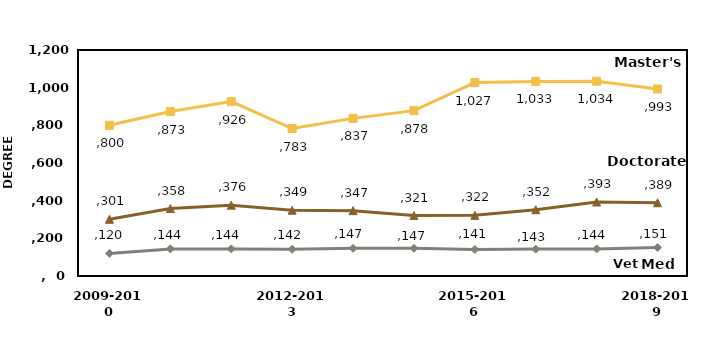
| Category | Series 0 | Series 1 | Series 2 |
|---|---|---|---|
| 2009-2010 | 120 | 800 | 301 |
| 2010-2011 | 144 | 873 | 358 |
| 2011-2012 | 144 | 926 | 376 |
| 2012-2013 | 142 | 783 | 349 |
| 2013-2014 | 147 | 837 | 347 |
| 2014-2015 | 147 | 878 | 321 |
| 2015-2016 | 141 | 1027 | 322 |
| 2016-2017 | 143 | 1033 | 352 |
| 2017-2018 | 144 | 1034 | 393 |
| 2018-2019 | 151 | 993 | 389 |